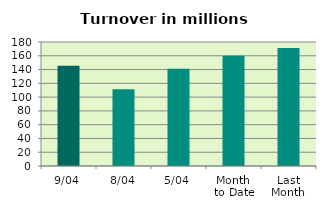
| Category | Series 0 |
|---|---|
| 9/04 | 145.44 |
| 8/04 | 111.52 |
| 5/04 | 141.171 |
| Month 
to Date | 160.128 |
| Last
Month | 171.15 |